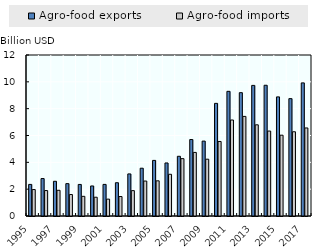
| Category | Agro-food exports | Agro-food imports |
|---|---|---|
| 1995.0 | 2.354 | 1.971 |
| 1996.0 | 2.791 | 1.897 |
| 1997.0 | 2.587 | 1.916 |
| 1998.0 | 2.412 | 1.6 |
| 1999.0 | 2.352 | 1.465 |
| 2000.0 | 2.239 | 1.399 |
| 2001.0 | 2.355 | 1.257 |
| 2002.0 | 2.48 | 1.451 |
| 2003.0 | 3.137 | 1.89 |
| 2004.0 | 3.562 | 2.605 |
| 2005.0 | 4.144 | 2.623 |
| 2006.0 | 3.954 | 3.109 |
| 2007.0 | 4.45 | 4.274 |
| 2008.0 | 5.699 | 4.739 |
| 2009.0 | 5.583 | 4.234 |
| 2010.0 | 8.395 | 5.555 |
| 2011.0 | 9.292 | 7.154 |
| 2012.0 | 9.193 | 7.424 |
| 2013.0 | 9.734 | 6.796 |
| 2014.0 | 9.745 | 6.332 |
| 2015.0 | 8.877 | 6.023 |
| 2016.0 | 8.748 | 6.278 |
| 2017.0 | 9.921 | 6.562 |